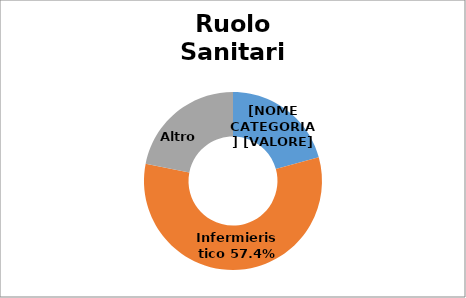
| Category | Series 0 |
|---|---|
| Medici e Odontoiatri | 0.207 |
| Infermieristico | 0.574 |
| Altro  | 0.219 |